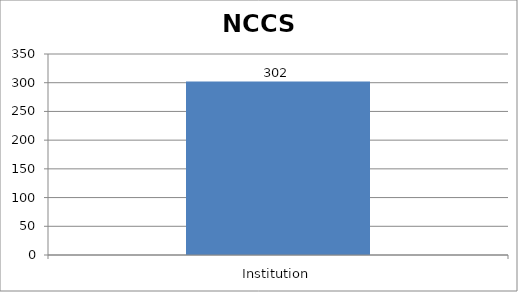
| Category | NCCS |
|---|---|
| Institution | 302 |